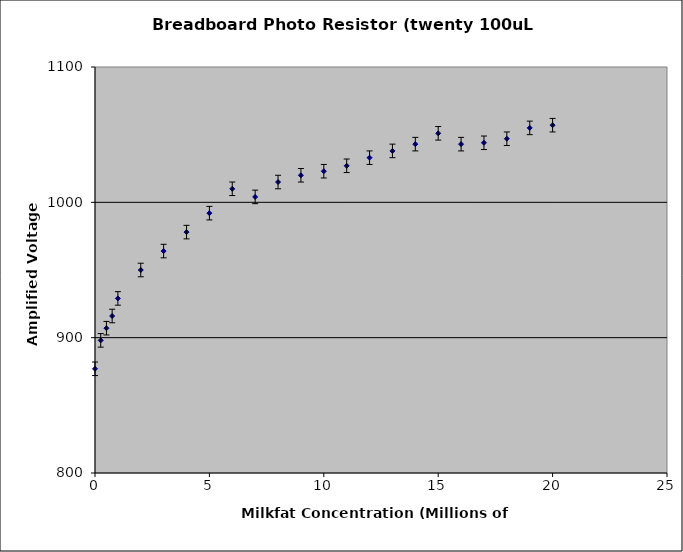
| Category | Series 0 |
|---|---|
| 0.0 | 877 |
| 0.25 | 898 |
| 0.5 | 907 |
| 0.75 | 916 |
| 1.0 | 929 |
| 2.0 | 950 |
| 3.0 | 964 |
| 4.0 | 978 |
| 5.0 | 992 |
| 6.0 | 1010 |
| 7.0 | 1004 |
| 8.0 | 1015 |
| 9.0 | 1020 |
| 10.0 | 1023 |
| 11.0 | 1027 |
| 12.0 | 1033 |
| 13.0 | 1038 |
| 14.0 | 1043 |
| 15.0 | 1051 |
| 16.0 | 1043 |
| 17.0 | 1044 |
| 18.0 | 1047 |
| 19.0 | 1055 |
| 20.0 | 1057 |